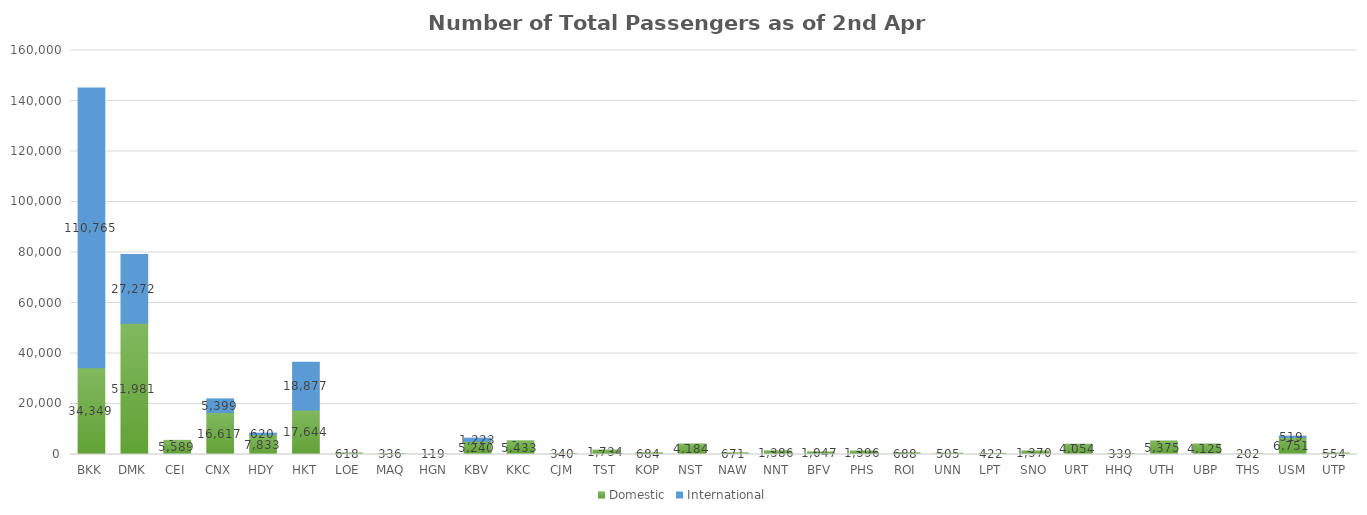
| Category | Domestic | International |
|---|---|---|
| BKK | 34349 | 110765 |
| DMK | 51981 | 27272 |
| CEI | 5589 | 0 |
| CNX | 16617 | 5399 |
| HDY | 7833 | 620 |
| HKT | 17644 | 18877 |
| LOE | 618 | 0 |
| MAQ | 336 | 0 |
| HGN | 119 | 0 |
| KBV | 5240 | 1223 |
| KKC | 5433 | 0 |
| CJM | 340 | 0 |
| TST | 1734 | 0 |
| KOP | 684 | 0 |
| NST | 4184 | 0 |
| NAW | 671 | 0 |
| NNT | 1386 | 0 |
| BFV | 1047 | 0 |
| PHS | 1396 | 0 |
| ROI | 688 | 0 |
| UNN | 505 | 0 |
| LPT | 422 | 0 |
| SNO | 1370 | 0 |
| URT | 4054 | 0 |
| HHQ | 339 | 0 |
| UTH | 5375 | 0 |
| UBP | 4125 | 0 |
| THS | 202 | 0 |
| USM | 6751 | 519 |
| UTP | 554 | 0 |